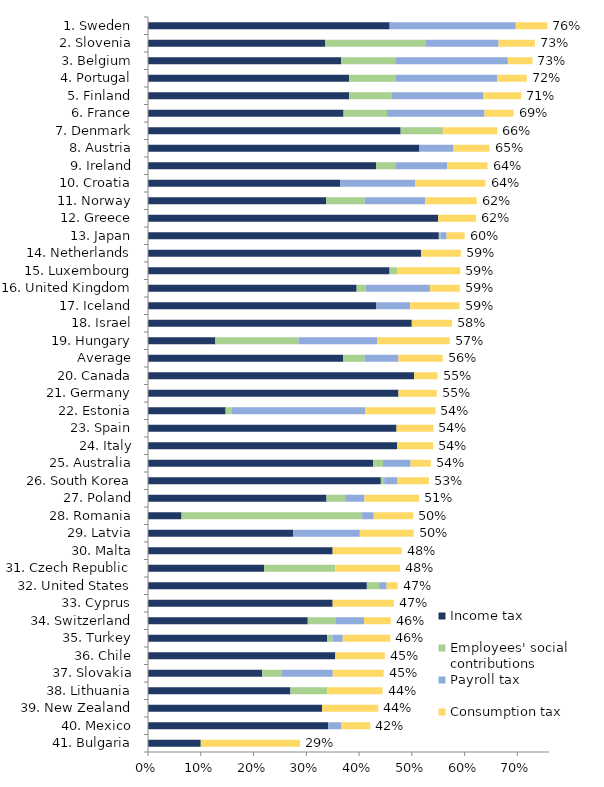
| Category | Income tax | Employees' social contributions | Payroll tax | Consumption tax | Effective marginal tax rate |
|---|---|---|---|---|---|
| 1. Sweden | 0.458 | 0 | 0.239 | 0.06 | 0.757 |
| 2. Slovenia | 0.335 | 0.19 | 0.139 | 0.069 | 0.733 |
| 3. Belgium | 0.366 | 0.103 | 0.213 | 0.046 | 0.729 |
| 4. Portugal | 0.381 | 0.089 | 0.192 | 0.056 | 0.718 |
| 5. Finland | 0.381 | 0.081 | 0.174 | 0.072 | 0.707 |
| 6. France | 0.371 | 0.082 | 0.185 | 0.055 | 0.693 |
| 7. Denmark | 0.479 | 0.08 | 0 | 0.103 | 0.662 |
| 8. Austria | 0.514 | 0 | 0.065 | 0.068 | 0.647 |
| 9. Ireland | 0.433 | 0.036 | 0.099 | 0.076 | 0.643 |
| 10. Croatia | 0.365 | 0 | 0.142 | 0.133 | 0.64 |
| 11. Norway | 0.338 | 0.073 | 0.115 | 0.097 | 0.623 |
| 12. Greece | 0.55 | 0 | 0 | 0.072 | 0.622 |
| 13. Japan | 0.551 | 0.003 | 0.012 | 0.034 | 0.6 |
| 14. Netherlands | 0.518 | 0 | 0 | 0.075 | 0.593 |
| 15. Luxembourg | 0.458 | 0.014 | 0 | 0.12 | 0.592 |
| 16. United Kingdom | 0.395 | 0.018 | 0.121 | 0.057 | 0.591 |
| 17. Iceland | 0.433 | 0 | 0.064 | 0.094 | 0.59 |
| 18. Israel | 0.5 | 0 | 0 | 0.076 | 0.576 |
| 19. Hungary | 0.128 | 0.157 | 0.149 | 0.138 | 0.572 |
| Average | 0.37 | 0.041 | 0.064 | 0.084 | 0.559 |
| 20. Canada | 0.505 | 0 | 0 | 0.044 | 0.549 |
| 21. Germany | 0.475 | 0 | 0 | 0.073 | 0.547 |
| 22. Estonia | 0.147 | 0.012 | 0.253 | 0.133 | 0.545 |
| 23. Spain | 0.471 | 0 | 0 | 0.07 | 0.541 |
| 24. Italy | 0.472 | 0 | 0 | 0.068 | 0.54 |
| 25. Australia | 0.426 | 0.019 | 0.052 | 0.038 | 0.536 |
| 26. South Korea | 0.441 | 0.006 | 0.025 | 0.059 | 0.532 |
| 27. Poland | 0.338 | 0.035 | 0.037 | 0.103 | 0.514 |
| 28. Romania | 0.064 | 0.342 | 0.022 | 0.075 | 0.503 |
| 29. Latvia | 0.275 | 0 | 0.127 | 0.102 | 0.504 |
| 30. Malta | 0.35 | 0 | 0 | 0.131 | 0.481 |
| 31. Czech Republic | 0.22 | 0.135 | 0 | 0.123 | 0.478 |
| 32. United States | 0.415 | 0.023 | 0.014 | 0.021 | 0.473 |
| 33. Cyprus | 0.35 | 0 | 0 | 0.116 | 0.466 |
| 34. Switzerland | 0.303 | 0.053 | 0.053 | 0.051 | 0.46 |
| 35. Turkey | 0.34 | 0.01 | 0.02 | 0.09 | 0.459 |
| 36. Chile | 0.355 | 0 | 0 | 0.094 | 0.449 |
| 37. Slovakia | 0.217 | 0.036 | 0.097 | 0.096 | 0.447 |
| 38. Lithuania | 0.27 | 0.07 | 0 | 0.105 | 0.445 |
| 39. New Zealand | 0.33 | 0 | 0 | 0.106 | 0.436 |
| 40. Mexico | 0.341 | 0 | 0.024 | 0.055 | 0.421 |
| 41. Bulgaria | 0.1 | 0 | 0 | 0.188 | 0.288 |